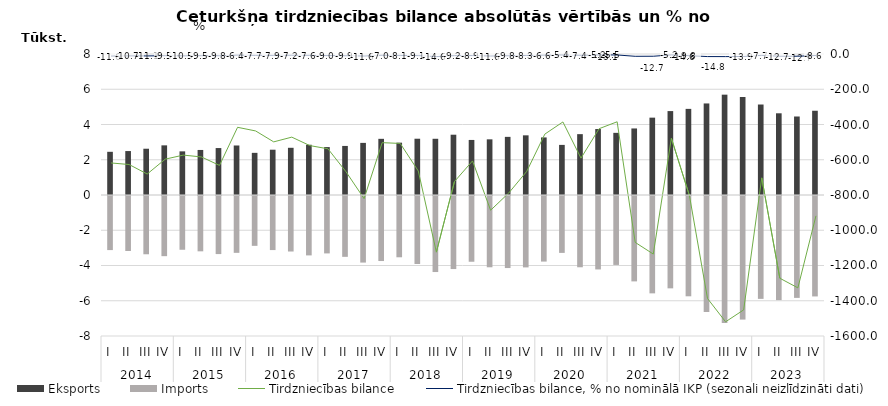
| Category | Eksports | Imports |
|---|---|---|
| 0 | 2450.7 | -3068.8 |
| 1 | 2493.4 | -3120.5 |
| 2 | 2625.5 | -3306.5 |
| 3 | 2816.7 | -3413.2 |
| 4 | 2476.5 | -3050.1 |
| 5 | 2555.2 | -3139.2 |
| 6 | 2663.4 | -3295.5 |
| 7 | 2809.5 | -3225.4 |
| 8 | 2391.5 | -2828.1 |
| 9 | 2569.5 | -3068 |
| 10 | 2678.2 | -3149.9 |
| 11 | 2850.8 | -3370.5 |
| 12 | 2719.6 | -3257.4 |
| 13 | 2783.8 | -3452 |
| 14 | 2956.9 | -3777.4 |
| 15 | 3187 | -3690 |
| 16 | 2969.9 | -3477.4 |
| 17 | 3193.3 | -3857.4 |
| 18 | 3189.7 | -4313.9 |
| 19 | 3420.5 | -4144.2 |
| 20 | 3123.6 | -3730.2 |
| 21 | 3158.2 | -4044.8 |
| 22 | 3298.5 | -4087.5 |
| 23 | 3385.3 | -4051.1 |
| 24 | 3266.4 | -3720.9 |
| 25 | 2842.7 | -3228.3 |
| 26 | 3452.8 | -4043.7 |
| 27 | 3742.7 | -4166.6 |
| 28 | 3526.2 | -3910.7 |
| 29 | 3776 | -4844.9 |
| 30 | 4388.7 | -5523.8 |
| 31 | 4761.5 | -5239.5 |
| 32 | 4886.7 | -5690.3 |
| 33 | 5194.3 | -6581.5 |
| 34 | 5692.8 | -7212.3 |
| 35 | 5559.7 | -7011.5 |
| 36 | 5134 | -5836.8 |
| 37 | 4635.9 | -5908.1 |
| 38 | 4454.2 | -5781.1 |
| 39 | 4780.2 | -5698.5 |